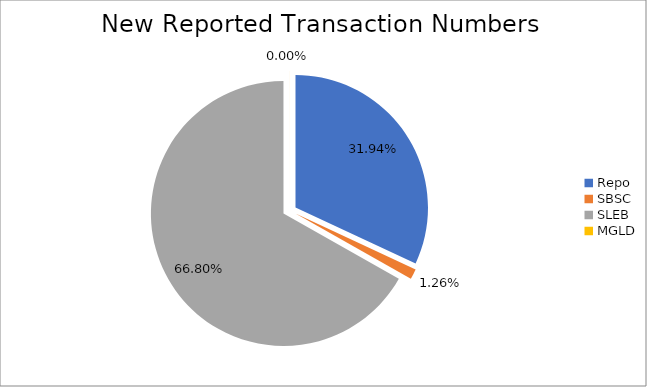
| Category | Series 0 |
|---|---|
| Repo | 308144 |
| SBSC | 12113 |
| SLEB | 644585 |
| MGLD | 41 |